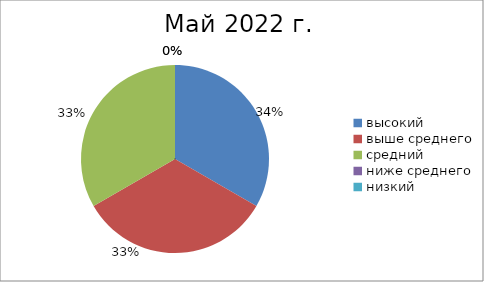
| Category | Series 0 |
|---|---|
| высокий | 2 |
| выше среднего | 2 |
| средний | 2 |
| ниже среднего | 0 |
| низкий | 0 |